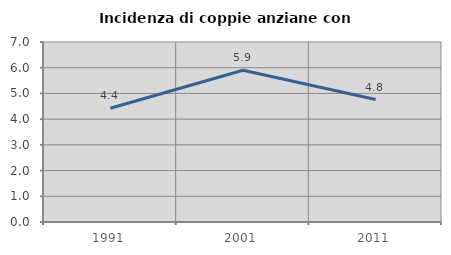
| Category | Incidenza di coppie anziane con figli |
|---|---|
| 1991.0 | 4.422 |
| 2001.0 | 5.901 |
| 2011.0 | 4.762 |